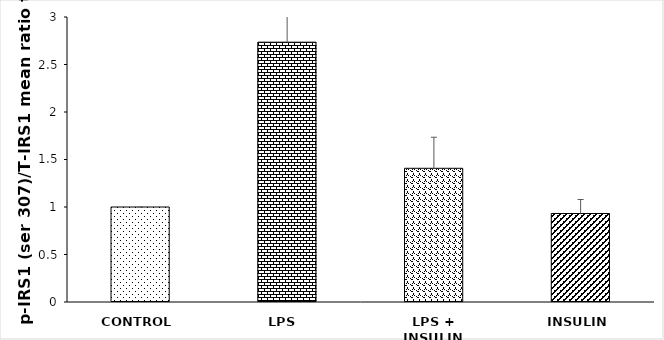
| Category | Series 0 |
|---|---|
| CONTROL | 1 |
| LPS  | 2.735 |
| LPS + INSULIN | 1.408 |
| INSULIN | 0.932 |